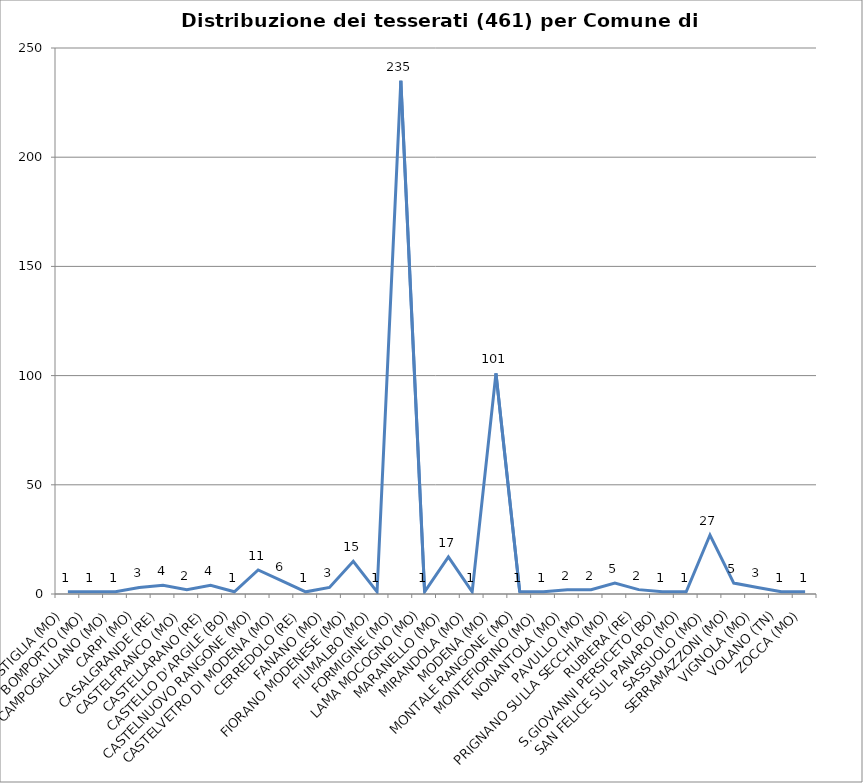
| Category | Nr. Tesserati |
|---|---|
| BASTIGLIA (MO) | 1 |
| BOMPORTO (MO) | 1 |
| CAMPOGALLIANO (MO) | 1 |
| CARPI (MO) | 3 |
| CASALGRANDE (RE) | 4 |
| CASTELFRANCO (MO) | 2 |
| CASTELLARANO (RE) | 4 |
| CASTELLO D'ARGILE (BO) | 1 |
| CASTELNUOVO RANGONE (MO) | 11 |
| CASTELVETRO DI MODENA (MO) | 6 |
| CERREDOLO (RE) | 1 |
| FANANO (MO) | 3 |
| FIORANO MODENESE (MO) | 15 |
| FIUMALBO (MO) | 1 |
| FORMIGINE (MO) | 235 |
| LAMA MOCOGNO (MO) | 1 |
| MARANELLO (MO) | 17 |
| MIRANDOLA (MO) | 1 |
| MODENA (MO) | 101 |
| MONTALE RANGONE (MO) | 1 |
| MONTEFIORINO (MO) | 1 |
| NONANTOLA (MO) | 2 |
| PAVULLO (MO) | 2 |
| PRIGNANO SULLA SECCHIA (MO) | 5 |
| RUBIERA (RE) | 2 |
| S.GIOVANNI PERSICETO (BO) | 1 |
| SAN FELICE SUL PANARO (MO) | 1 |
| SASSUOLO (MO) | 27 |
| SERRAMAZZONI (MO) | 5 |
| VIGNOLA (MO) | 3 |
| VOLANO (TN) | 1 |
| ZOCCA (MO) | 1 |